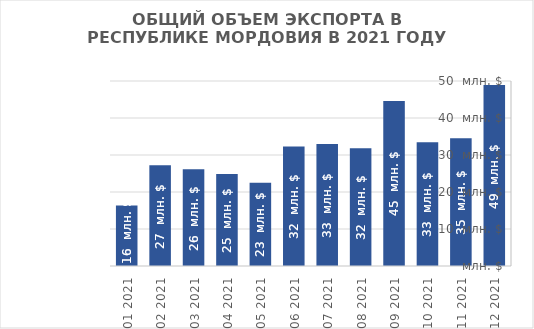
| Category | Итог |
|---|---|
| 12 2021 | 48908.4 |
| 11 2021 | 34538.58 |
| 10 2021 | 33471.97 |
| 09 2021 | 44612.59 |
| 08 2021 | 31827.2 |
| 07 2021 | 32971.91 |
| 06 2021 | 32276.43 |
| 05 2021 | 22505.96 |
| 04 2021 | 24860.28 |
| 03 2021 | 26164.76 |
| 02 2021 | 27258.54 |
| 01 2021 | 16329.09 |